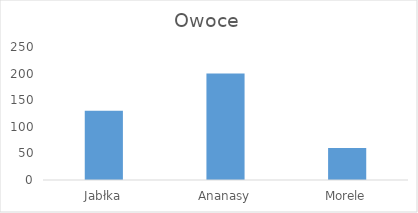
| Category | Series 0 |
|---|---|
| Jabłka | 130 |
| Ananasy | 200 |
| Morele | 60 |